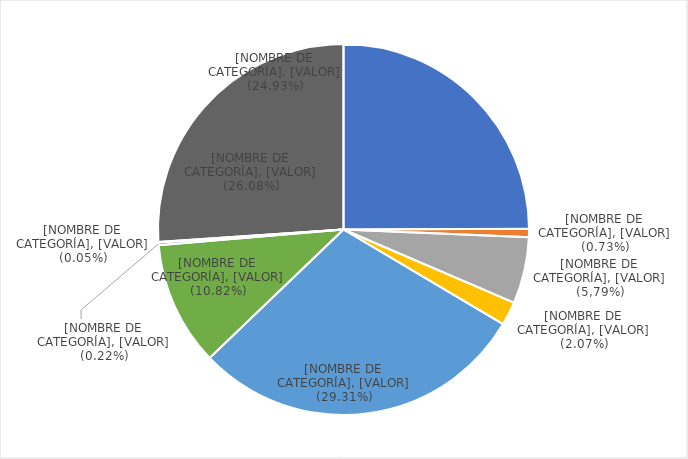
| Category | TOTAL DE PERITOS |
|---|---|
| Medicina | 1025 |
| Antropología | 30 |
| Genética | 238 |
| Odontología | 85 |
| Criminalística | 1205 |
| Dactiloscopía | 445 |
| Radiología | 9 |
| Arqueología | 2 |
| Sin especificar | 1072 |